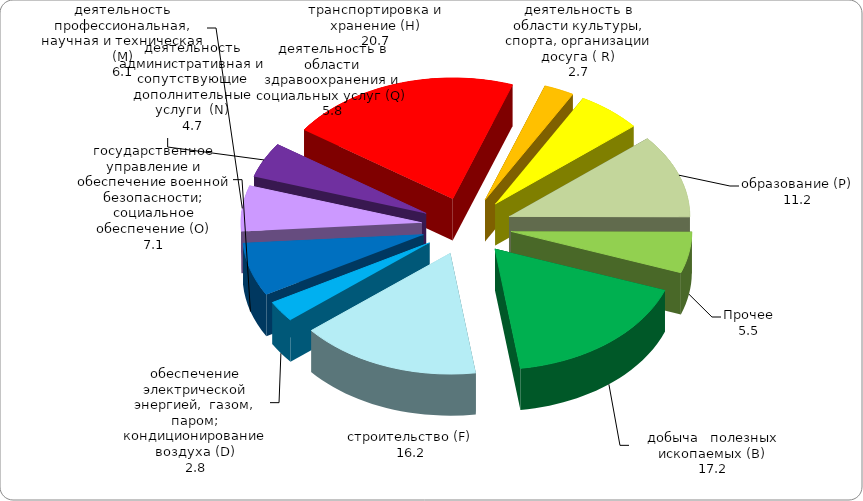
| Category | Series 3 | Series 2 | Series 1 | Series 0 |
|---|---|---|---|---|
|     добыча   полезных    ископаемых (В) | 17.2 |  |  |  |
| строительство (F) | 16.2 |  |  |  |
| обеспечение электрической энергией,  газом, паром; кондиционирование воздуха (D) | 2.8 |  |  |  |
| государственное управление и обеспечение военной безопасности; социальное обеспечение (О) | 7.1 |  |  |  |
| деятельность профессиональная, научная и техническая (М) | 6.1 |  |  |  |
| деятельность административная и сопутствующие дополнительные услуги  (N) | 4.7 |  |  |  |
| транспортировка и хранение (H) | 20.7 |  |  |  |
| деятельность в области культуры, спорта, организации досуга ( R) | 2.7 |  |  |  |
| деятельность в области здравоохранения и социальных услуг (Q) | 5.8 |  |  |  |
| образование (Р) | 11.2 |  |  |  |
| Прочее | 5.5 |  |  |  |